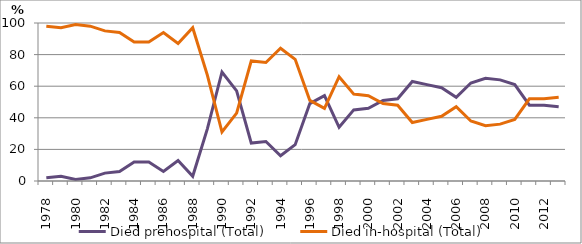
| Category | Died prehospital (Total) | Died in-hospital (Total) |
|---|---|---|
| 1978.0 | 2 | 98 |
| 1979.0 | 3 | 97 |
| 1980.0 | 1 | 99 |
| 1981.0 | 2 | 98 |
| 1982.0 | 5 | 95 |
| 1983.0 | 6 | 94 |
| 1984.0 | 12 | 88 |
| 1985.0 | 12 | 88 |
| 1986.0 | 6 | 94 |
| 1987.0 | 13 | 87 |
| 1988.0 | 3 | 97 |
| 1989.0 | 33 | 67 |
| 1990.0 | 69 | 31 |
| 1991.0 | 57 | 43 |
| 1992.0 | 24 | 76 |
| 1993.0 | 25 | 75 |
| 1994.0 | 16 | 84 |
| 1995.0 | 23 | 77 |
| 1996.0 | 49 | 51 |
| 1997.0 | 54 | 46 |
| 1998.0 | 34 | 66 |
| 1999.0 | 45 | 55 |
| 2000.0 | 46 | 54 |
| 2001.0 | 51 | 49 |
| 2002.0 | 52 | 48 |
| 2003.0 | 63 | 37 |
| 2004.0 | 61 | 39 |
| 2005.0 | 59 | 41 |
| 2006.0 | 53 | 47 |
| 2007.0 | 62 | 38 |
| 2008.0 | 65 | 35 |
| 2009.0 | 64 | 36 |
| 2010.0 | 61 | 39 |
| 2011.0 | 48 | 52 |
| 2012.0 | 48 | 52 |
| 2013.0 | 47 | 53 |